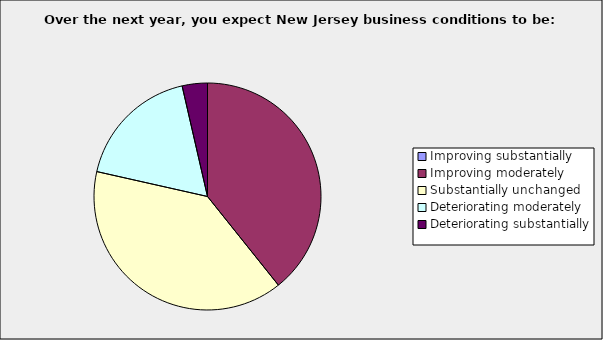
| Category | Series 0 |
|---|---|
| Improving substantially | 0 |
| Improving moderately | 0.393 |
| Substantially unchanged | 0.393 |
| Deteriorating moderately | 0.179 |
| Deteriorating substantially | 0.036 |